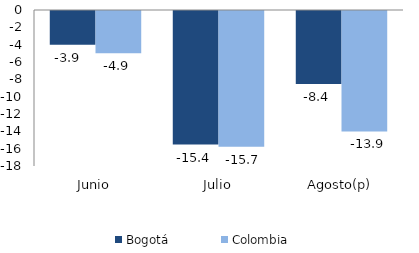
| Category | Bogotá | Colombia |
|---|---|---|
| Junio | -3.892 | -4.863 |
| Julio | -15.413 | -15.668 |
| Agosto(p) | -8.435 | -13.898 |